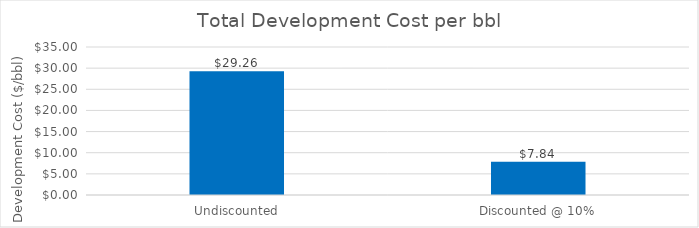
| Category | Total Cost per bbl |
|---|---|
| Undiscounted | 29.261 |
| Discounted @ 10% | 7.842 |